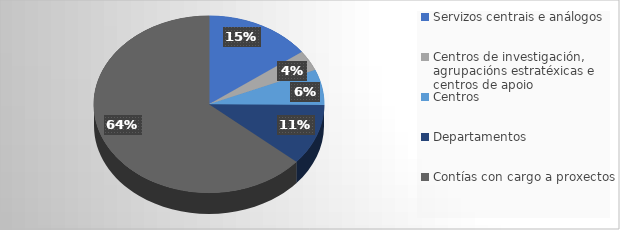
| Category | Series 0 | Series 1 |
|---|---|---|
| Servizos centrais e análogos | 51584.87 |  |
| Centros de investigación, agrupacións estratéxicas e centros de apoio | 12907.18 |  |
| Centros | 22497.32 |  |
| Departamentos | 38608.28 |  |
| Contías con cargo a proxectos | 220524.28 |  |